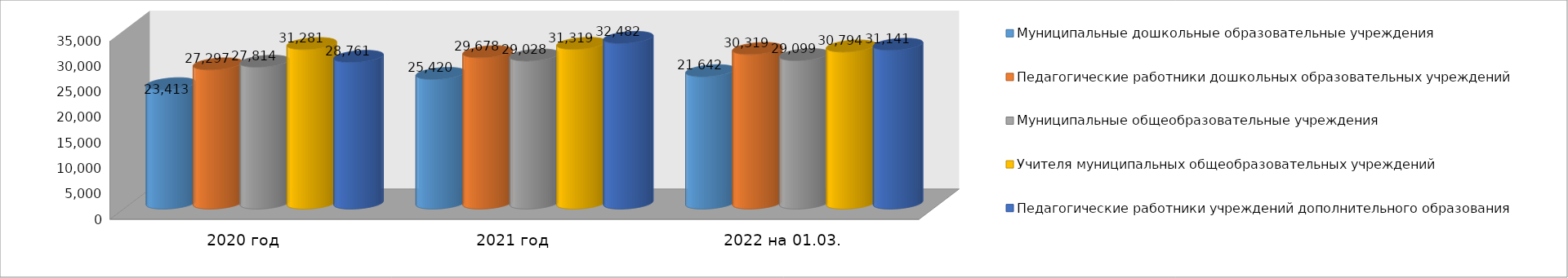
| Category | Муниципальные дошкольные образовательные учреждения | Педагогические работники дошкольных образовательных учреждений | Муниципальные общеобразовательные учреждения | Учителя муниципальных общеобразовательных учреждений | Педагогические работники учреждений дополнительного образования |
|---|---|---|---|---|---|
| 2020 год | 23413 | 27297 | 27814 | 31281 | 28761 |
| 2021 год | 25420 | 29678 | 29028 | 31319 | 32482 |
| 2022 на 01.03. | 25959 | 30319 | 29099 | 30794 | 31141 |